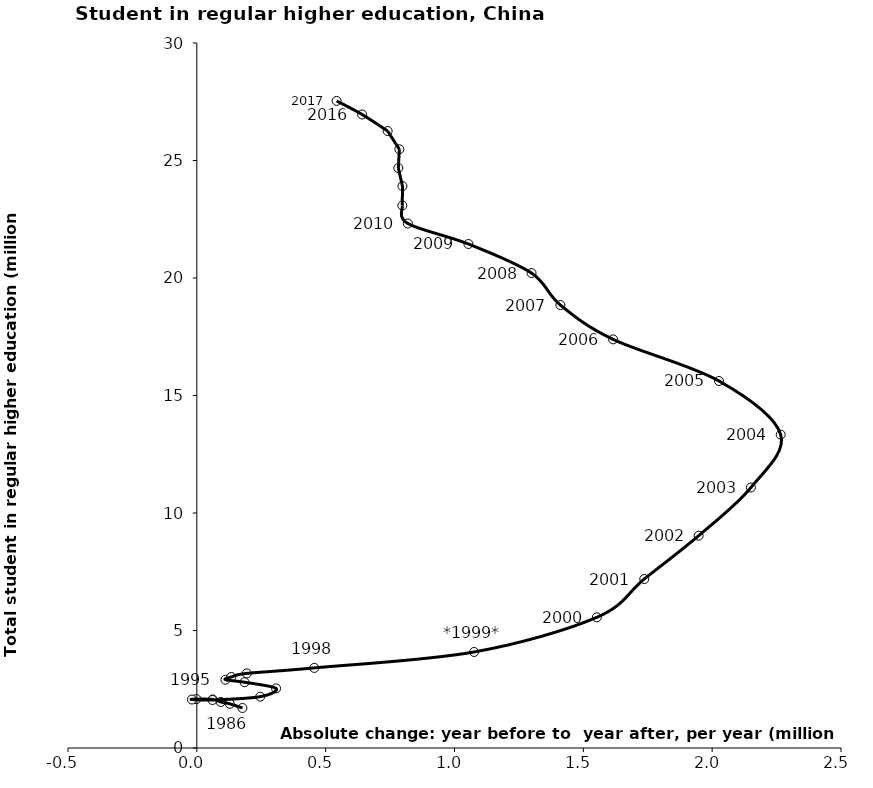
| Category | Series 0 |
|---|---|
| 0.17699999999999982 | 1.703 |
| 0.128 | 1.88 |
| 0.09299999999999997 | 1.959 |
| 0.06149999999999989 | 2.066 |
| -0.0014999999999998348 | 2.082 |
| -0.018999999999999906 | 2.063 |
| 0.0605 | 2.044 |
| 0.246 | 2.184 |
| 0.3074999999999999 | 2.536 |
| 0.18500000000000005 | 2.799 |
| 0.11099999999999999 | 2.906 |
| 0.1339999999999999 | 3.021 |
| 0.19399999999999995 | 3.174 |
| 0.4560000000000002 | 3.409 |
| 1.076 | 4.086 |
| 1.5524999999999998 | 5.561 |
| 1.7365000000000004 | 7.191 |
| 1.9475000000000002 | 9.034 |
| 2.1505 | 11.086 |
| 2.266 | 13.335 |
| 2.0265000000000004 | 15.618 |
| 1.6155 | 17.388 |
| 1.4109999999999996 | 18.849 |
| 1.2989999999999995 | 20.21 |
| 1.0540000000000003 | 21.447 |
| 0.8190000000000008 | 22.318 |
| 0.7974999999999994 | 23.085 |
| 0.798 | 23.913 |
| 0.782 | 24.681 |
| 0.7859999999999996 | 25.477 |
| 0.740499999999999 | 26.253 |
| 0.6415000000000006 | 26.958 |
| 0.5425000000000022 | 27.536 |